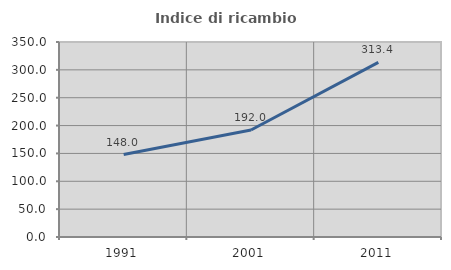
| Category | Indice di ricambio occupazionale  |
|---|---|
| 1991.0 | 148.04 |
| 2001.0 | 192.042 |
| 2011.0 | 313.363 |